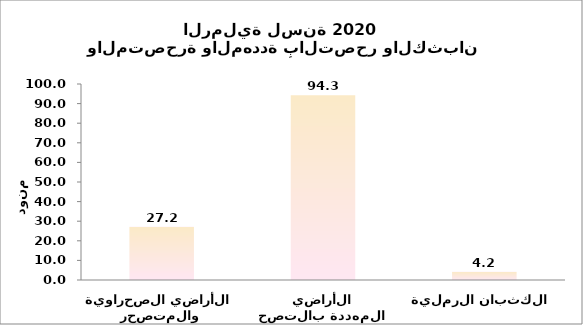
| Category | Series 0 |
|---|---|
| الأراضي الصحراوية والمتصحرة | 27.22 |
| الأراضي المهددة بالتصحر | 94.294 |
| الكثبان الرملية | 4.242 |